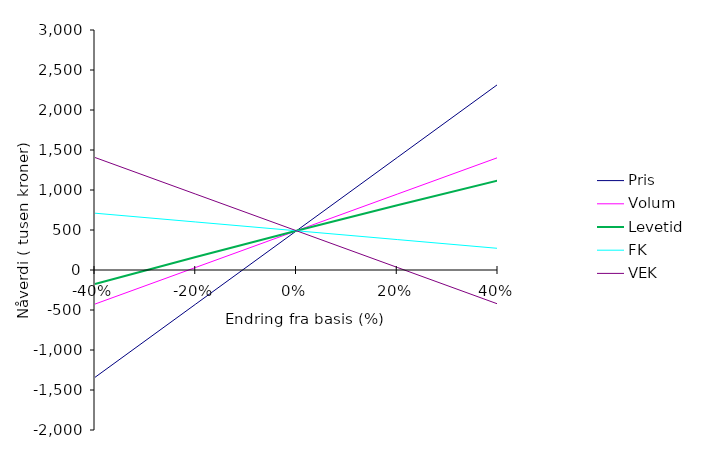
| Category | Pris | Volum | Levetid | FK | VEK |
|---|---|---|---|---|---|
| -0.4 | -1341.594 | -425.653 | -175.128 | 710.115 | 1406.23 |
| -0.19999999999999996 | -425.653 | 32.318 | 162.497 | 600.202 | 948.259 |
| 0.0 | 490.289 | 490.289 | 490.289 | 490.289 | 490.289 |
| 0.19999999999999996 | 1406.23 | 948.259 | 808.533 | 380.376 | 32.318 |
| 0.3999999999999999 | 2322.172 | 1406.23 | 1117.508 | 270.463 | -425.653 |